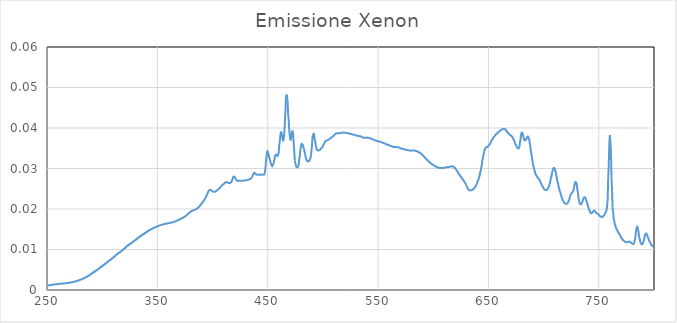
| Category | Series 0 |
|---|---|
| 250.0 | 0.001 |
| 250.5 | 0.001 |
| 251.0 | 0.001 |
| 251.5 | 0.001 |
| 252.0 | 0.001 |
| 252.5 | 0.001 |
| 253.0 | 0.001 |
| 253.5 | 0.001 |
| 254.0 | 0.001 |
| 254.5 | 0.001 |
| 255.0 | 0.001 |
| 255.5 | 0.001 |
| 256.0 | 0.001 |
| 256.5 | 0.001 |
| 257.0 | 0.001 |
| 257.5 | 0.001 |
| 258.0 | 0.001 |
| 258.5 | 0.001 |
| 259.0 | 0.001 |
| 259.5 | 0.001 |
| 260.0 | 0.001 |
| 260.5 | 0.002 |
| 261.0 | 0.002 |
| 261.5 | 0.002 |
| 262.0 | 0.002 |
| 262.5 | 0.002 |
| 263.0 | 0.002 |
| 263.5 | 0.002 |
| 264.0 | 0.002 |
| 264.5 | 0.002 |
| 265.0 | 0.002 |
| 265.5 | 0.002 |
| 266.0 | 0.002 |
| 266.5 | 0.002 |
| 267.0 | 0.002 |
| 267.5 | 0.002 |
| 268.0 | 0.002 |
| 268.5 | 0.002 |
| 269.0 | 0.002 |
| 269.5 | 0.002 |
| 270.0 | 0.002 |
| 270.5 | 0.002 |
| 271.0 | 0.002 |
| 271.5 | 0.002 |
| 272.0 | 0.002 |
| 272.5 | 0.002 |
| 273.0 | 0.002 |
| 273.5 | 0.002 |
| 274.0 | 0.002 |
| 274.5 | 0.002 |
| 275.0 | 0.002 |
| 275.5 | 0.002 |
| 276.0 | 0.002 |
| 276.5 | 0.002 |
| 277.0 | 0.002 |
| 277.5 | 0.002 |
| 278.0 | 0.002 |
| 278.5 | 0.002 |
| 279.0 | 0.002 |
| 279.5 | 0.002 |
| 280.0 | 0.002 |
| 280.5 | 0.003 |
| 281.0 | 0.003 |
| 281.5 | 0.003 |
| 282.0 | 0.003 |
| 282.5 | 0.003 |
| 283.0 | 0.003 |
| 283.5 | 0.003 |
| 284.0 | 0.003 |
| 284.5 | 0.003 |
| 285.0 | 0.003 |
| 285.5 | 0.003 |
| 286.0 | 0.003 |
| 286.5 | 0.003 |
| 287.0 | 0.003 |
| 287.5 | 0.003 |
| 288.0 | 0.004 |
| 288.5 | 0.004 |
| 289.0 | 0.004 |
| 289.5 | 0.004 |
| 290.0 | 0.004 |
| 290.5 | 0.004 |
| 291.0 | 0.004 |
| 291.5 | 0.004 |
| 292.0 | 0.004 |
| 292.5 | 0.004 |
| 293.0 | 0.004 |
| 293.5 | 0.005 |
| 294.0 | 0.005 |
| 294.5 | 0.005 |
| 295.0 | 0.005 |
| 295.5 | 0.005 |
| 296.0 | 0.005 |
| 296.5 | 0.005 |
| 297.0 | 0.005 |
| 297.5 | 0.005 |
| 298.0 | 0.005 |
| 298.5 | 0.006 |
| 299.0 | 0.006 |
| 299.5 | 0.006 |
| 300.0 | 0.006 |
| 300.5 | 0.006 |
| 301.0 | 0.006 |
| 301.5 | 0.006 |
| 302.0 | 0.006 |
| 302.5 | 0.007 |
| 303.0 | 0.007 |
| 303.5 | 0.007 |
| 304.0 | 0.007 |
| 304.5 | 0.007 |
| 305.0 | 0.007 |
| 305.5 | 0.007 |
| 306.0 | 0.007 |
| 306.5 | 0.007 |
| 307.0 | 0.007 |
| 307.5 | 0.007 |
| 308.0 | 0.008 |
| 308.5 | 0.008 |
| 309.0 | 0.008 |
| 309.5 | 0.008 |
| 310.0 | 0.008 |
| 310.5 | 0.008 |
| 311.0 | 0.008 |
| 311.5 | 0.008 |
| 312.0 | 0.008 |
| 312.5 | 0.009 |
| 313.0 | 0.009 |
| 313.5 | 0.009 |
| 314.0 | 0.009 |
| 314.5 | 0.009 |
| 315.0 | 0.009 |
| 315.5 | 0.009 |
| 316.0 | 0.009 |
| 316.5 | 0.01 |
| 317.0 | 0.01 |
| 317.5 | 0.01 |
| 318.0 | 0.01 |
| 318.5 | 0.01 |
| 319.0 | 0.01 |
| 319.5 | 0.01 |
| 320.0 | 0.01 |
| 320.5 | 0.01 |
| 321.0 | 0.01 |
| 321.5 | 0.011 |
| 322.0 | 0.011 |
| 322.5 | 0.011 |
| 323.0 | 0.011 |
| 323.5 | 0.011 |
| 324.0 | 0.011 |
| 324.5 | 0.011 |
| 325.0 | 0.011 |
| 325.5 | 0.011 |
| 326.0 | 0.011 |
| 326.5 | 0.012 |
| 327.0 | 0.012 |
| 327.5 | 0.012 |
| 328.0 | 0.012 |
| 328.5 | 0.012 |
| 329.0 | 0.012 |
| 329.5 | 0.012 |
| 330.0 | 0.012 |
| 330.5 | 0.012 |
| 331.0 | 0.012 |
| 331.5 | 0.013 |
| 332.0 | 0.013 |
| 332.5 | 0.013 |
| 333.0 | 0.013 |
| 333.5 | 0.013 |
| 334.0 | 0.013 |
| 334.5 | 0.013 |
| 335.0 | 0.013 |
| 335.5 | 0.013 |
| 336.0 | 0.014 |
| 336.5 | 0.014 |
| 337.0 | 0.014 |
| 337.5 | 0.014 |
| 338.0 | 0.014 |
| 338.5 | 0.014 |
| 339.0 | 0.014 |
| 339.5 | 0.014 |
| 340.0 | 0.014 |
| 340.5 | 0.014 |
| 341.0 | 0.014 |
| 341.5 | 0.015 |
| 342.0 | 0.015 |
| 342.5 | 0.015 |
| 343.0 | 0.015 |
| 343.5 | 0.015 |
| 344.0 | 0.015 |
| 344.5 | 0.015 |
| 345.0 | 0.015 |
| 345.5 | 0.015 |
| 346.0 | 0.015 |
| 346.5 | 0.015 |
| 347.0 | 0.015 |
| 347.5 | 0.015 |
| 348.0 | 0.015 |
| 348.5 | 0.016 |
| 349.0 | 0.016 |
| 349.5 | 0.016 |
| 350.0 | 0.016 |
| 350.5 | 0.016 |
| 351.0 | 0.016 |
| 351.5 | 0.016 |
| 352.0 | 0.016 |
| 352.5 | 0.016 |
| 353.0 | 0.016 |
| 353.5 | 0.016 |
| 354.0 | 0.016 |
| 354.5 | 0.016 |
| 355.0 | 0.016 |
| 355.5 | 0.016 |
| 356.0 | 0.016 |
| 356.5 | 0.016 |
| 357.0 | 0.016 |
| 357.5 | 0.016 |
| 358.0 | 0.016 |
| 358.5 | 0.016 |
| 359.0 | 0.016 |
| 359.5 | 0.016 |
| 360.0 | 0.016 |
| 360.5 | 0.017 |
| 361.0 | 0.017 |
| 361.5 | 0.017 |
| 362.0 | 0.017 |
| 362.5 | 0.017 |
| 363.0 | 0.017 |
| 363.5 | 0.017 |
| 364.0 | 0.017 |
| 364.5 | 0.017 |
| 365.0 | 0.017 |
| 365.5 | 0.017 |
| 366.0 | 0.017 |
| 366.5 | 0.017 |
| 367.0 | 0.017 |
| 367.5 | 0.017 |
| 368.0 | 0.017 |
| 368.5 | 0.017 |
| 369.0 | 0.017 |
| 369.5 | 0.017 |
| 370.0 | 0.017 |
| 370.5 | 0.018 |
| 371.0 | 0.018 |
| 371.5 | 0.018 |
| 372.0 | 0.018 |
| 372.5 | 0.018 |
| 373.0 | 0.018 |
| 373.5 | 0.018 |
| 374.0 | 0.018 |
| 374.5 | 0.018 |
| 375.0 | 0.018 |
| 375.5 | 0.018 |
| 376.0 | 0.018 |
| 376.5 | 0.018 |
| 377.0 | 0.019 |
| 377.5 | 0.019 |
| 378.0 | 0.019 |
| 378.5 | 0.019 |
| 379.0 | 0.019 |
| 379.5 | 0.019 |
| 380.0 | 0.019 |
| 380.5 | 0.019 |
| 381.0 | 0.019 |
| 381.5 | 0.02 |
| 382.0 | 0.02 |
| 382.5 | 0.02 |
| 383.0 | 0.02 |
| 383.5 | 0.02 |
| 384.0 | 0.02 |
| 384.5 | 0.02 |
| 385.0 | 0.02 |
| 385.5 | 0.02 |
| 386.0 | 0.02 |
| 386.5 | 0.02 |
| 387.0 | 0.02 |
| 387.5 | 0.02 |
| 388.0 | 0.021 |
| 388.5 | 0.021 |
| 389.0 | 0.021 |
| 389.5 | 0.021 |
| 390.0 | 0.021 |
| 390.5 | 0.022 |
| 391.0 | 0.022 |
| 391.5 | 0.022 |
| 392.0 | 0.022 |
| 392.5 | 0.022 |
| 393.0 | 0.022 |
| 393.5 | 0.023 |
| 394.0 | 0.023 |
| 394.5 | 0.023 |
| 395.0 | 0.024 |
| 395.5 | 0.024 |
| 396.0 | 0.024 |
| 396.5 | 0.024 |
| 397.0 | 0.025 |
| 397.5 | 0.025 |
| 398.0 | 0.025 |
| 398.5 | 0.025 |
| 399.0 | 0.025 |
| 399.5 | 0.024 |
| 400.0 | 0.024 |
| 400.5 | 0.024 |
| 401.0 | 0.024 |
| 401.5 | 0.024 |
| 402.0 | 0.024 |
| 402.5 | 0.024 |
| 403.0 | 0.024 |
| 403.5 | 0.024 |
| 404.0 | 0.025 |
| 404.5 | 0.025 |
| 405.0 | 0.025 |
| 405.5 | 0.025 |
| 406.0 | 0.025 |
| 406.5 | 0.025 |
| 407.0 | 0.025 |
| 407.5 | 0.026 |
| 408.0 | 0.026 |
| 408.5 | 0.026 |
| 409.0 | 0.026 |
| 409.5 | 0.026 |
| 410.0 | 0.026 |
| 410.5 | 0.026 |
| 411.0 | 0.026 |
| 411.5 | 0.027 |
| 412.0 | 0.027 |
| 412.5 | 0.027 |
| 413.0 | 0.027 |
| 413.5 | 0.027 |
| 414.0 | 0.026 |
| 414.5 | 0.026 |
| 415.0 | 0.026 |
| 415.5 | 0.026 |
| 416.0 | 0.026 |
| 416.5 | 0.027 |
| 417.0 | 0.027 |
| 417.5 | 0.027 |
| 418.0 | 0.027 |
| 418.5 | 0.028 |
| 419.0 | 0.028 |
| 419.5 | 0.028 |
| 420.0 | 0.028 |
| 420.5 | 0.028 |
| 421.0 | 0.027 |
| 421.5 | 0.027 |
| 422.0 | 0.027 |
| 422.5 | 0.027 |
| 423.0 | 0.027 |
| 423.5 | 0.027 |
| 424.0 | 0.027 |
| 424.5 | 0.027 |
| 425.0 | 0.027 |
| 425.5 | 0.027 |
| 426.0 | 0.027 |
| 426.5 | 0.027 |
| 427.0 | 0.027 |
| 427.5 | 0.027 |
| 428.0 | 0.027 |
| 428.5 | 0.027 |
| 429.0 | 0.027 |
| 429.5 | 0.027 |
| 430.0 | 0.027 |
| 430.5 | 0.027 |
| 431.0 | 0.027 |
| 431.5 | 0.027 |
| 432.0 | 0.027 |
| 432.5 | 0.027 |
| 433.0 | 0.027 |
| 433.5 | 0.027 |
| 434.0 | 0.027 |
| 434.5 | 0.027 |
| 435.0 | 0.028 |
| 435.5 | 0.028 |
| 436.0 | 0.028 |
| 436.5 | 0.028 |
| 437.0 | 0.029 |
| 437.5 | 0.029 |
| 438.0 | 0.029 |
| 438.5 | 0.029 |
| 439.0 | 0.029 |
| 439.5 | 0.029 |
| 440.0 | 0.028 |
| 440.5 | 0.028 |
| 441.0 | 0.028 |
| 441.5 | 0.028 |
| 442.0 | 0.028 |
| 442.5 | 0.028 |
| 443.0 | 0.029 |
| 443.5 | 0.028 |
| 444.0 | 0.028 |
| 444.5 | 0.028 |
| 445.0 | 0.028 |
| 445.5 | 0.028 |
| 446.0 | 0.028 |
| 446.5 | 0.029 |
| 447.0 | 0.029 |
| 447.5 | 0.029 |
| 448.0 | 0.03 |
| 448.5 | 0.032 |
| 449.0 | 0.033 |
| 449.5 | 0.034 |
| 450.0 | 0.034 |
| 450.5 | 0.034 |
| 451.0 | 0.033 |
| 451.5 | 0.033 |
| 452.0 | 0.032 |
| 452.5 | 0.032 |
| 453.0 | 0.031 |
| 453.5 | 0.031 |
| 454.0 | 0.031 |
| 454.5 | 0.031 |
| 455.0 | 0.031 |
| 455.5 | 0.032 |
| 456.0 | 0.032 |
| 456.5 | 0.033 |
| 457.0 | 0.033 |
| 457.5 | 0.033 |
| 458.0 | 0.033 |
| 458.5 | 0.033 |
| 459.0 | 0.033 |
| 459.5 | 0.033 |
| 460.0 | 0.034 |
| 460.5 | 0.036 |
| 461.0 | 0.037 |
| 461.5 | 0.038 |
| 462.0 | 0.039 |
| 462.5 | 0.039 |
| 463.0 | 0.038 |
| 463.5 | 0.037 |
| 464.0 | 0.037 |
| 464.5 | 0.037 |
| 465.0 | 0.039 |
| 465.5 | 0.041 |
| 466.0 | 0.044 |
| 466.5 | 0.047 |
| 467.0 | 0.048 |
| 467.5 | 0.048 |
| 468.0 | 0.046 |
| 468.5 | 0.043 |
| 469.0 | 0.042 |
| 469.5 | 0.04 |
| 470.0 | 0.038 |
| 470.5 | 0.037 |
| 471.0 | 0.037 |
| 471.5 | 0.038 |
| 472.0 | 0.039 |
| 472.5 | 0.039 |
| 473.0 | 0.039 |
| 473.5 | 0.036 |
| 474.0 | 0.035 |
| 474.5 | 0.032 |
| 475.0 | 0.031 |
| 475.5 | 0.031 |
| 476.0 | 0.03 |
| 476.5 | 0.03 |
| 477.0 | 0.03 |
| 477.5 | 0.03 |
| 478.0 | 0.031 |
| 478.5 | 0.032 |
| 479.0 | 0.033 |
| 479.5 | 0.034 |
| 480.0 | 0.035 |
| 480.5 | 0.036 |
| 481.0 | 0.036 |
| 481.5 | 0.036 |
| 482.0 | 0.036 |
| 482.5 | 0.035 |
| 483.0 | 0.035 |
| 483.5 | 0.034 |
| 484.0 | 0.033 |
| 484.5 | 0.033 |
| 485.0 | 0.032 |
| 485.5 | 0.032 |
| 486.0 | 0.032 |
| 486.5 | 0.032 |
| 487.0 | 0.032 |
| 487.5 | 0.032 |
| 488.0 | 0.032 |
| 488.5 | 0.032 |
| 489.0 | 0.033 |
| 489.5 | 0.034 |
| 490.0 | 0.035 |
| 490.5 | 0.037 |
| 491.0 | 0.038 |
| 491.5 | 0.039 |
| 492.0 | 0.038 |
| 492.5 | 0.037 |
| 493.0 | 0.037 |
| 493.5 | 0.036 |
| 494.0 | 0.035 |
| 494.5 | 0.035 |
| 495.0 | 0.035 |
| 495.5 | 0.034 |
| 496.0 | 0.034 |
| 496.5 | 0.034 |
| 497.0 | 0.035 |
| 497.5 | 0.035 |
| 498.0 | 0.035 |
| 498.5 | 0.035 |
| 499.0 | 0.035 |
| 499.5 | 0.035 |
| 500.0 | 0.036 |
| 500.5 | 0.036 |
| 501.0 | 0.036 |
| 501.5 | 0.036 |
| 502.0 | 0.037 |
| 502.5 | 0.037 |
| 503.0 | 0.037 |
| 503.5 | 0.037 |
| 504.0 | 0.037 |
| 504.5 | 0.037 |
| 505.0 | 0.037 |
| 505.5 | 0.037 |
| 506.0 | 0.037 |
| 506.5 | 0.037 |
| 507.0 | 0.037 |
| 507.5 | 0.038 |
| 508.0 | 0.038 |
| 508.5 | 0.038 |
| 509.0 | 0.038 |
| 509.5 | 0.038 |
| 510.0 | 0.038 |
| 510.5 | 0.038 |
| 511.0 | 0.038 |
| 511.5 | 0.039 |
| 512.0 | 0.039 |
| 512.5 | 0.039 |
| 513.0 | 0.039 |
| 513.5 | 0.039 |
| 514.0 | 0.039 |
| 514.5 | 0.039 |
| 515.0 | 0.039 |
| 515.5 | 0.039 |
| 516.0 | 0.039 |
| 516.5 | 0.039 |
| 517.0 | 0.039 |
| 517.5 | 0.039 |
| 518.0 | 0.039 |
| 518.5 | 0.039 |
| 519.0 | 0.039 |
| 519.5 | 0.039 |
| 520.0 | 0.039 |
| 520.5 | 0.039 |
| 521.0 | 0.039 |
| 521.5 | 0.039 |
| 522.0 | 0.039 |
| 522.5 | 0.039 |
| 523.0 | 0.039 |
| 523.5 | 0.039 |
| 524.0 | 0.039 |
| 524.5 | 0.039 |
| 525.0 | 0.039 |
| 525.5 | 0.039 |
| 526.0 | 0.038 |
| 526.5 | 0.038 |
| 527.0 | 0.038 |
| 527.5 | 0.038 |
| 528.0 | 0.038 |
| 528.5 | 0.038 |
| 529.0 | 0.038 |
| 529.5 | 0.038 |
| 530.0 | 0.038 |
| 530.5 | 0.038 |
| 531.0 | 0.038 |
| 531.5 | 0.038 |
| 532.0 | 0.038 |
| 532.5 | 0.038 |
| 533.0 | 0.038 |
| 533.5 | 0.038 |
| 534.0 | 0.038 |
| 534.5 | 0.038 |
| 535.0 | 0.038 |
| 535.5 | 0.038 |
| 536.0 | 0.038 |
| 536.5 | 0.038 |
| 537.0 | 0.038 |
| 537.5 | 0.038 |
| 538.0 | 0.038 |
| 538.5 | 0.038 |
| 539.0 | 0.038 |
| 539.5 | 0.038 |
| 540.0 | 0.038 |
| 540.5 | 0.038 |
| 541.0 | 0.038 |
| 541.5 | 0.038 |
| 542.0 | 0.038 |
| 542.5 | 0.037 |
| 543.0 | 0.037 |
| 543.5 | 0.037 |
| 544.0 | 0.037 |
| 544.5 | 0.037 |
| 545.0 | 0.037 |
| 545.5 | 0.037 |
| 546.0 | 0.037 |
| 546.5 | 0.037 |
| 547.0 | 0.037 |
| 547.5 | 0.037 |
| 548.0 | 0.037 |
| 548.5 | 0.037 |
| 549.0 | 0.037 |
| 549.5 | 0.037 |
| 550.0 | 0.037 |
| 550.5 | 0.037 |
| 551.0 | 0.037 |
| 551.5 | 0.037 |
| 552.0 | 0.037 |
| 552.5 | 0.037 |
| 553.0 | 0.036 |
| 553.5 | 0.036 |
| 554.0 | 0.036 |
| 554.5 | 0.036 |
| 555.0 | 0.036 |
| 555.5 | 0.036 |
| 556.0 | 0.036 |
| 556.5 | 0.036 |
| 557.0 | 0.036 |
| 557.5 | 0.036 |
| 558.0 | 0.036 |
| 558.5 | 0.036 |
| 559.0 | 0.036 |
| 559.5 | 0.036 |
| 560.0 | 0.036 |
| 560.5 | 0.036 |
| 561.0 | 0.036 |
| 561.5 | 0.036 |
| 562.0 | 0.036 |
| 562.5 | 0.035 |
| 563.0 | 0.035 |
| 563.5 | 0.035 |
| 564.0 | 0.035 |
| 564.5 | 0.035 |
| 565.0 | 0.035 |
| 565.5 | 0.035 |
| 566.0 | 0.035 |
| 566.5 | 0.035 |
| 567.0 | 0.035 |
| 567.5 | 0.035 |
| 568.0 | 0.035 |
| 568.5 | 0.035 |
| 569.0 | 0.035 |
| 569.5 | 0.035 |
| 570.0 | 0.035 |
| 570.5 | 0.035 |
| 571.0 | 0.035 |
| 571.5 | 0.035 |
| 572.0 | 0.035 |
| 572.5 | 0.035 |
| 573.0 | 0.035 |
| 573.5 | 0.035 |
| 574.0 | 0.035 |
| 574.5 | 0.035 |
| 575.0 | 0.035 |
| 575.5 | 0.035 |
| 576.0 | 0.035 |
| 576.5 | 0.035 |
| 577.0 | 0.035 |
| 577.5 | 0.034 |
| 578.0 | 0.034 |
| 578.5 | 0.034 |
| 579.0 | 0.034 |
| 579.5 | 0.034 |
| 580.0 | 0.034 |
| 580.5 | 0.034 |
| 581.0 | 0.034 |
| 581.5 | 0.034 |
| 582.0 | 0.034 |
| 582.5 | 0.034 |
| 583.0 | 0.034 |
| 583.5 | 0.034 |
| 584.0 | 0.034 |
| 584.5 | 0.034 |
| 585.0 | 0.034 |
| 585.5 | 0.034 |
| 586.0 | 0.034 |
| 586.5 | 0.034 |
| 587.0 | 0.034 |
| 587.5 | 0.034 |
| 588.0 | 0.034 |
| 588.5 | 0.034 |
| 589.0 | 0.034 |
| 589.5 | 0.034 |
| 590.0 | 0.033 |
| 590.5 | 0.033 |
| 591.0 | 0.033 |
| 591.5 | 0.033 |
| 592.0 | 0.033 |
| 592.5 | 0.033 |
| 593.0 | 0.033 |
| 593.5 | 0.032 |
| 594.0 | 0.032 |
| 594.5 | 0.032 |
| 595.0 | 0.032 |
| 595.5 | 0.032 |
| 596.0 | 0.032 |
| 596.5 | 0.032 |
| 597.0 | 0.031 |
| 597.5 | 0.031 |
| 598.0 | 0.031 |
| 598.5 | 0.031 |
| 599.0 | 0.031 |
| 599.5 | 0.031 |
| 600.0 | 0.031 |
| 600.5 | 0.031 |
| 601.0 | 0.031 |
| 601.5 | 0.031 |
| 602.0 | 0.031 |
| 602.5 | 0.03 |
| 603.0 | 0.03 |
| 603.5 | 0.03 |
| 604.0 | 0.03 |
| 604.5 | 0.03 |
| 605.0 | 0.03 |
| 605.5 | 0.03 |
| 606.0 | 0.03 |
| 606.5 | 0.03 |
| 607.0 | 0.03 |
| 607.5 | 0.03 |
| 608.0 | 0.03 |
| 608.5 | 0.03 |
| 609.0 | 0.03 |
| 609.5 | 0.03 |
| 610.0 | 0.03 |
| 610.5 | 0.03 |
| 611.0 | 0.03 |
| 611.5 | 0.03 |
| 612.0 | 0.03 |
| 612.5 | 0.03 |
| 613.0 | 0.03 |
| 613.5 | 0.03 |
| 614.0 | 0.03 |
| 614.5 | 0.03 |
| 615.0 | 0.03 |
| 615.5 | 0.03 |
| 616.0 | 0.03 |
| 616.5 | 0.031 |
| 617.0 | 0.031 |
| 617.5 | 0.031 |
| 618.0 | 0.03 |
| 618.5 | 0.03 |
| 619.0 | 0.03 |
| 619.5 | 0.03 |
| 620.0 | 0.03 |
| 620.5 | 0.03 |
| 621.0 | 0.03 |
| 621.5 | 0.029 |
| 622.0 | 0.029 |
| 622.5 | 0.029 |
| 623.0 | 0.029 |
| 623.5 | 0.029 |
| 624.0 | 0.028 |
| 624.5 | 0.028 |
| 625.0 | 0.028 |
| 625.5 | 0.028 |
| 626.0 | 0.028 |
| 626.5 | 0.027 |
| 627.0 | 0.027 |
| 627.5 | 0.027 |
| 628.0 | 0.027 |
| 628.5 | 0.027 |
| 629.0 | 0.026 |
| 629.5 | 0.026 |
| 630.0 | 0.026 |
| 630.5 | 0.025 |
| 631.0 | 0.025 |
| 631.5 | 0.025 |
| 632.0 | 0.025 |
| 632.5 | 0.025 |
| 633.0 | 0.025 |
| 633.5 | 0.025 |
| 634.0 | 0.025 |
| 634.5 | 0.025 |
| 635.0 | 0.025 |
| 635.5 | 0.025 |
| 636.0 | 0.025 |
| 636.5 | 0.025 |
| 637.0 | 0.025 |
| 637.5 | 0.025 |
| 638.0 | 0.025 |
| 638.5 | 0.026 |
| 639.0 | 0.026 |
| 639.5 | 0.026 |
| 640.0 | 0.027 |
| 640.5 | 0.027 |
| 641.0 | 0.027 |
| 641.5 | 0.028 |
| 642.0 | 0.028 |
| 642.5 | 0.029 |
| 643.0 | 0.029 |
| 643.5 | 0.03 |
| 644.0 | 0.031 |
| 644.5 | 0.032 |
| 645.0 | 0.033 |
| 645.5 | 0.033 |
| 646.0 | 0.034 |
| 646.5 | 0.035 |
| 647.0 | 0.035 |
| 647.5 | 0.035 |
| 648.0 | 0.035 |
| 648.5 | 0.035 |
| 649.0 | 0.035 |
| 649.5 | 0.035 |
| 650.0 | 0.036 |
| 650.5 | 0.036 |
| 651.0 | 0.036 |
| 651.5 | 0.036 |
| 652.0 | 0.036 |
| 652.5 | 0.037 |
| 653.0 | 0.037 |
| 653.5 | 0.037 |
| 654.0 | 0.037 |
| 654.5 | 0.038 |
| 655.0 | 0.038 |
| 655.5 | 0.038 |
| 656.0 | 0.038 |
| 656.5 | 0.038 |
| 657.0 | 0.038 |
| 657.5 | 0.039 |
| 658.0 | 0.039 |
| 658.5 | 0.039 |
| 659.0 | 0.039 |
| 659.5 | 0.039 |
| 660.0 | 0.039 |
| 660.5 | 0.039 |
| 661.0 | 0.039 |
| 661.5 | 0.04 |
| 662.0 | 0.04 |
| 662.5 | 0.04 |
| 663.0 | 0.04 |
| 663.5 | 0.04 |
| 664.0 | 0.04 |
| 664.5 | 0.04 |
| 665.0 | 0.04 |
| 665.5 | 0.04 |
| 666.0 | 0.039 |
| 666.5 | 0.039 |
| 667.0 | 0.039 |
| 667.5 | 0.039 |
| 668.0 | 0.039 |
| 668.5 | 0.039 |
| 669.0 | 0.038 |
| 669.5 | 0.038 |
| 670.0 | 0.038 |
| 670.5 | 0.038 |
| 671.0 | 0.038 |
| 671.5 | 0.038 |
| 672.0 | 0.038 |
| 672.5 | 0.037 |
| 673.0 | 0.037 |
| 673.5 | 0.037 |
| 674.0 | 0.036 |
| 674.5 | 0.036 |
| 675.0 | 0.036 |
| 675.5 | 0.035 |
| 676.0 | 0.035 |
| 676.5 | 0.035 |
| 677.0 | 0.035 |
| 677.5 | 0.035 |
| 678.0 | 0.035 |
| 678.5 | 0.036 |
| 679.0 | 0.037 |
| 679.5 | 0.038 |
| 680.0 | 0.039 |
| 680.5 | 0.039 |
| 681.0 | 0.039 |
| 681.5 | 0.038 |
| 682.0 | 0.037 |
| 682.5 | 0.037 |
| 683.0 | 0.037 |
| 683.5 | 0.037 |
| 684.0 | 0.037 |
| 684.5 | 0.037 |
| 685.0 | 0.038 |
| 685.5 | 0.038 |
| 686.0 | 0.038 |
| 686.5 | 0.037 |
| 687.0 | 0.037 |
| 687.5 | 0.036 |
| 688.0 | 0.035 |
| 688.5 | 0.034 |
| 689.0 | 0.034 |
| 689.5 | 0.032 |
| 690.0 | 0.032 |
| 690.5 | 0.031 |
| 691.0 | 0.03 |
| 691.5 | 0.03 |
| 692.0 | 0.029 |
| 692.5 | 0.029 |
| 693.0 | 0.029 |
| 693.5 | 0.028 |
| 694.0 | 0.028 |
| 694.5 | 0.028 |
| 695.0 | 0.028 |
| 695.5 | 0.027 |
| 696.0 | 0.027 |
| 696.5 | 0.027 |
| 697.0 | 0.027 |
| 697.5 | 0.026 |
| 698.0 | 0.026 |
| 698.5 | 0.026 |
| 699.0 | 0.026 |
| 699.5 | 0.025 |
| 700.0 | 0.025 |
| 700.5 | 0.025 |
| 701.0 | 0.025 |
| 701.5 | 0.025 |
| 702.0 | 0.025 |
| 702.5 | 0.025 |
| 703.0 | 0.025 |
| 703.5 | 0.025 |
| 704.0 | 0.025 |
| 704.5 | 0.026 |
| 705.0 | 0.026 |
| 705.5 | 0.026 |
| 706.0 | 0.027 |
| 706.5 | 0.028 |
| 707.0 | 0.028 |
| 707.5 | 0.029 |
| 708.0 | 0.029 |
| 708.5 | 0.03 |
| 709.0 | 0.03 |
| 709.5 | 0.03 |
| 710.0 | 0.03 |
| 710.5 | 0.029 |
| 711.0 | 0.029 |
| 711.5 | 0.028 |
| 712.0 | 0.028 |
| 712.5 | 0.027 |
| 713.0 | 0.026 |
| 713.5 | 0.026 |
| 714.0 | 0.025 |
| 714.5 | 0.024 |
| 715.0 | 0.024 |
| 715.5 | 0.024 |
| 716.0 | 0.023 |
| 716.5 | 0.023 |
| 717.0 | 0.022 |
| 717.5 | 0.022 |
| 718.0 | 0.022 |
| 718.5 | 0.022 |
| 719.0 | 0.021 |
| 719.5 | 0.021 |
| 720.0 | 0.021 |
| 720.5 | 0.021 |
| 721.0 | 0.021 |
| 721.5 | 0.021 |
| 722.0 | 0.022 |
| 722.5 | 0.022 |
| 723.0 | 0.022 |
| 723.5 | 0.023 |
| 724.0 | 0.023 |
| 724.5 | 0.024 |
| 725.0 | 0.024 |
| 725.5 | 0.024 |
| 726.0 | 0.024 |
| 726.5 | 0.024 |
| 727.0 | 0.025 |
| 727.5 | 0.025 |
| 728.0 | 0.026 |
| 728.5 | 0.027 |
| 729.0 | 0.027 |
| 729.5 | 0.027 |
| 730.0 | 0.026 |
| 730.5 | 0.025 |
| 731.0 | 0.024 |
| 731.5 | 0.023 |
| 732.0 | 0.022 |
| 732.5 | 0.021 |
| 733.0 | 0.021 |
| 733.5 | 0.021 |
| 734.0 | 0.021 |
| 734.5 | 0.021 |
| 735.0 | 0.022 |
| 735.5 | 0.022 |
| 736.0 | 0.023 |
| 736.5 | 0.023 |
| 737.0 | 0.023 |
| 737.5 | 0.023 |
| 738.0 | 0.023 |
| 738.5 | 0.022 |
| 739.0 | 0.022 |
| 739.5 | 0.021 |
| 740.0 | 0.021 |
| 740.5 | 0.02 |
| 741.0 | 0.02 |
| 741.5 | 0.02 |
| 742.0 | 0.019 |
| 742.5 | 0.019 |
| 743.0 | 0.019 |
| 743.5 | 0.019 |
| 744.0 | 0.019 |
| 744.5 | 0.019 |
| 745.0 | 0.019 |
| 745.5 | 0.02 |
| 746.0 | 0.02 |
| 746.5 | 0.019 |
| 747.0 | 0.019 |
| 747.5 | 0.019 |
| 748.0 | 0.019 |
| 748.5 | 0.019 |
| 749.0 | 0.019 |
| 749.5 | 0.019 |
| 750.0 | 0.019 |
| 750.5 | 0.018 |
| 751.0 | 0.018 |
| 751.5 | 0.018 |
| 752.0 | 0.018 |
| 752.5 | 0.018 |
| 753.0 | 0.018 |
| 753.5 | 0.018 |
| 754.0 | 0.018 |
| 754.5 | 0.018 |
| 755.0 | 0.019 |
| 755.5 | 0.019 |
| 756.0 | 0.019 |
| 756.5 | 0.02 |
| 757.0 | 0.02 |
| 757.5 | 0.021 |
| 758.0 | 0.022 |
| 758.5 | 0.028 |
| 759.0 | 0.031 |
| 759.5 | 0.036 |
| 760.0 | 0.038 |
| 760.5 | 0.036 |
| 761.0 | 0.034 |
| 761.5 | 0.028 |
| 762.0 | 0.024 |
| 762.5 | 0.02 |
| 763.0 | 0.019 |
| 763.5 | 0.018 |
| 764.0 | 0.017 |
| 764.5 | 0.016 |
| 765.0 | 0.016 |
| 765.5 | 0.015 |
| 766.0 | 0.015 |
| 766.5 | 0.015 |
| 767.0 | 0.015 |
| 767.5 | 0.014 |
| 768.0 | 0.014 |
| 768.5 | 0.014 |
| 769.0 | 0.014 |
| 769.5 | 0.013 |
| 770.0 | 0.013 |
| 770.5 | 0.013 |
| 771.0 | 0.013 |
| 771.5 | 0.012 |
| 772.0 | 0.012 |
| 772.5 | 0.012 |
| 773.0 | 0.012 |
| 773.5 | 0.012 |
| 774.0 | 0.012 |
| 774.5 | 0.012 |
| 775.0 | 0.012 |
| 775.5 | 0.012 |
| 776.0 | 0.012 |
| 776.5 | 0.012 |
| 777.0 | 0.012 |
| 777.5 | 0.012 |
| 778.0 | 0.012 |
| 778.5 | 0.012 |
| 779.0 | 0.012 |
| 779.5 | 0.012 |
| 780.0 | 0.012 |
| 780.5 | 0.011 |
| 781.0 | 0.011 |
| 781.5 | 0.011 |
| 782.0 | 0.012 |
| 782.5 | 0.012 |
| 783.0 | 0.013 |
| 783.5 | 0.014 |
| 784.0 | 0.015 |
| 784.5 | 0.016 |
| 785.0 | 0.016 |
| 785.5 | 0.015 |
| 786.0 | 0.014 |
| 786.5 | 0.013 |
| 787.0 | 0.013 |
| 787.5 | 0.012 |
| 788.0 | 0.012 |
| 788.5 | 0.011 |
| 789.0 | 0.011 |
| 789.5 | 0.011 |
| 790.0 | 0.012 |
| 790.5 | 0.012 |
| 791.0 | 0.012 |
| 791.5 | 0.013 |
| 792.0 | 0.014 |
| 792.5 | 0.014 |
| 793.0 | 0.014 |
| 793.5 | 0.014 |
| 794.0 | 0.013 |
| 794.5 | 0.013 |
| 795.0 | 0.013 |
| 795.5 | 0.012 |
| 796.0 | 0.012 |
| 796.5 | 0.012 |
| 797.0 | 0.011 |
| 797.5 | 0.011 |
| 798.0 | 0.011 |
| 798.5 | 0.011 |
| 799.0 | 0.011 |
| 799.5 | 0.011 |
| 800.0 | 0.011 |